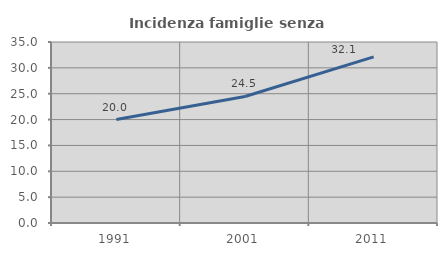
| Category | Incidenza famiglie senza nuclei |
|---|---|
| 1991.0 | 20 |
| 2001.0 | 24.471 |
| 2011.0 | 32.133 |